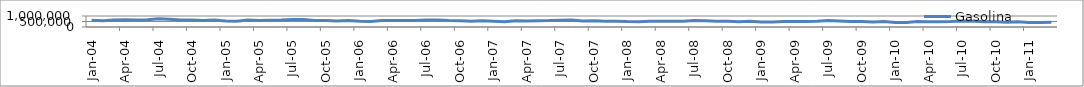
| Category | Gasolina |
|---|---|
| 2004-01-31 | 603463.521 |
| 2004-02-28 | 569317.867 |
| 2004-03-31 | 641382.575 |
| 2004-04-30 | 662184.51 |
| 2004-05-31 | 627488.162 |
| 2004-06-30 | 667013.325 |
| 2004-07-31 | 738920.796 |
| 2004-08-31 | 710695.215 |
| 2004-09-30 | 638428.451 |
| 2004-10-31 | 627183.282 |
| 2004-11-30 | 592772.014 |
| 2004-12-31 | 641909.697 |
| 2005-01-31 | 550740.415 |
| 2005-02-28 | 528612.784 |
| 2005-03-31 | 628384.423 |
| 2005-04-30 | 600861.295 |
| 2005-05-31 | 619228.033 |
| 2005-06-30 | 631673.159 |
| 2005-07-31 | 683861.611 |
| 2005-08-31 | 689311.644 |
| 2005-09-30 | 600603.21 |
| 2005-10-31 | 590508.121 |
| 2005-11-30 | 549730.287 |
| 2005-12-31 | 595522.622 |
| 2006-01-31 | 532616.474 |
| 2006-02-28 | 507219.26 |
| 2006-03-31 | 584416.591 |
| 2006-04-30 | 583372.407 |
| 2006-05-31 | 597975.082 |
| 2006-06-30 | 596298.344 |
| 2006-07-31 | 632328.44 |
| 2006-08-31 | 643231.079 |
| 2006-09-30 | 583325.863 |
| 2006-10-31 | 574522.175 |
| 2006-11-30 | 533132.151 |
| 2006-12-31 | 571539.809 |
| 2007-01-31 | 522182.88 |
| 2007-02-28 | 485651.4 |
| 2007-03-31 | 577570.35 |
| 2007-04-30 | 550795.01 |
| 2007-05-31 | 565998.76 |
| 2007-06-30 | 580183.72 |
| 2007-07-31 | 618939.8 |
| 2007-08-31 | 633264.4 |
| 2007-09-30 | 537295.54 |
| 2007-10-31 | 574018.64 |
| 2007-11-30 | 518332.71 |
| 2007-12-31 | 532806.26 |
| 2008-01-31 | 493849.22 |
| 2008-02-29 | 488254.25 |
| 2008-03-31 | 525620.22 |
| 2008-04-30 | 520710.43 |
| 2008-05-31 | 528906.74 |
| 2008-06-30 | 520827.9 |
| 2008-07-31 | 589972.19 |
| 2008-08-31 | 577170.49 |
| 2008-09-30 | 520119.23 |
| 2008-10-31 | 528470.3 |
| 2008-11-30 | 476811.22 |
| 2008-12-31 | 525079.26 |
| 2009-01-31 | 462173.79 |
| 2009-02-28 | 445294.26 |
| 2009-03-31 | 495807.94 |
| 2009-04-30 | 511118.79 |
| 2009-05-31 | 497271.12 |
| 2009-06-30 | 522017.26 |
| 2009-07-31 | 581255.35 |
| 2009-08-31 | 552135.86 |
| 2009-09-30 | 498488.4 |
| 2009-10-31 | 507482.59 |
| 2009-11-30 | 449781.81 |
| 2009-12-31 | 489995.97 |
| 2010-01-31 | 416457.7 |
| 2010-02-28 | 414864.39 |
| 2010-03-31 | 495234.37 |
| 2010-04-30 | 469198.4 |
| 2010-05-31 | 471377.99 |
| 2010-06-30 | 490185.59 |
| 2010-07-31 | 541795.6 |
| 2010-08-31 | 524602.04 |
| 2010-09-30 | 483926.43 |
| 2010-10-31 | 466953.91 |
| 2010-11-30 | 435609.22 |
| 2010-12-31 | 467008.81 |
| 2011-01-31 | 403862.47 |
| 2011-02-28 | 398953.99 |
| 2011-03-31 | 431000 |